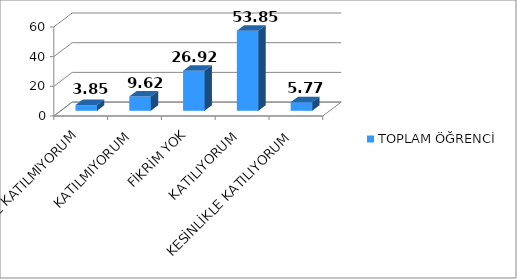
| Category | TOPLAM ÖĞRENCİ |
|---|---|
| KESİNLİKLE KATILMIYORUM | 3.85 |
| KATILMIYORUM | 9.62 |
| FİKRİM YOK | 26.92 |
| KATILIYORUM | 53.85 |
| KESİNLİKLE KATILIYORUM | 5.77 |